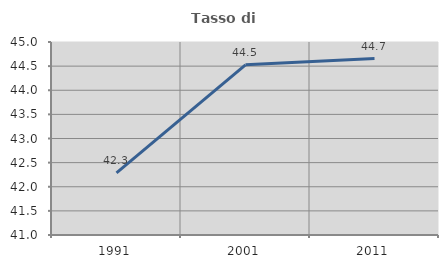
| Category | Tasso di occupazione   |
|---|---|
| 1991.0 | 42.289 |
| 2001.0 | 44.527 |
| 2011.0 | 44.656 |